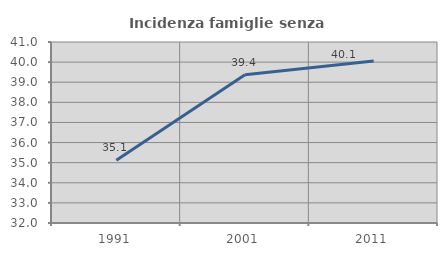
| Category | Incidenza famiglie senza nuclei |
|---|---|
| 1991.0 | 35.123 |
| 2001.0 | 39.372 |
| 2011.0 | 40.052 |